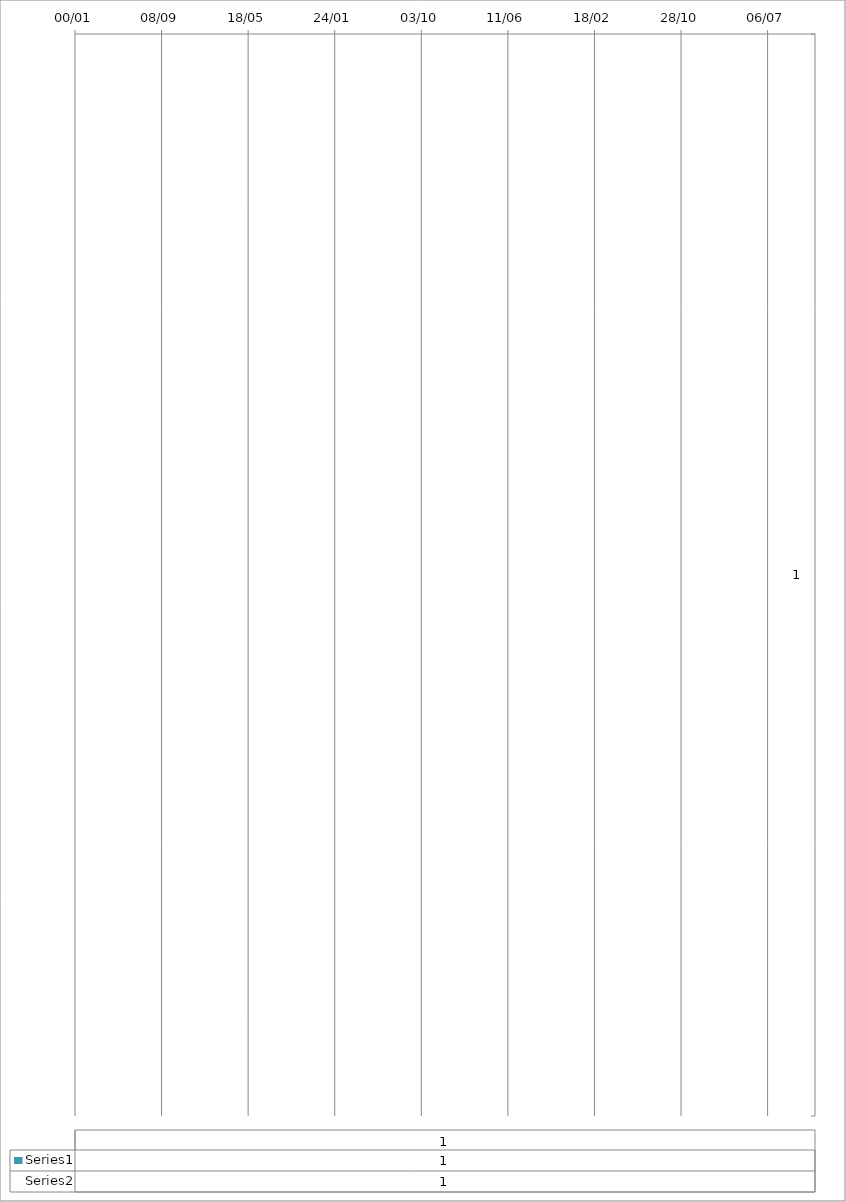
| Category | Series 4 | Series 5 |
|---|---|---|
| 0 | 1 | 1 |